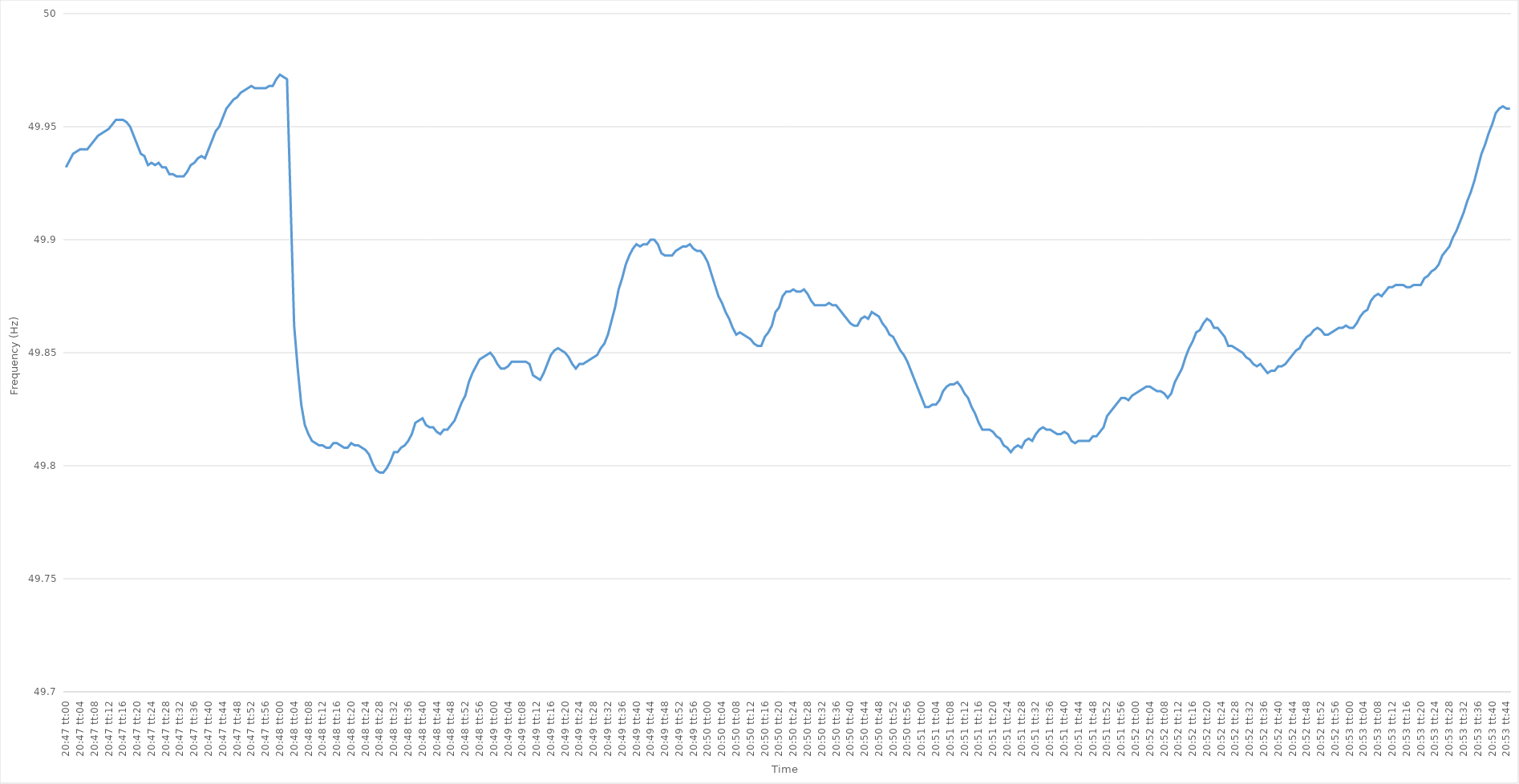
| Category | Series 0 |
|---|---|
| 0.8659722222222223 | 49.932 |
| 0.8659837962962963 | 49.935 |
| 0.8659953703703703 | 49.938 |
| 0.8660069444444445 | 49.939 |
| 0.8660185185185186 | 49.94 |
| 0.8660300925925926 | 49.94 |
| 0.8660416666666667 | 49.94 |
| 0.8660532407407407 | 49.942 |
| 0.8660648148148148 | 49.944 |
| 0.8660763888888888 | 49.946 |
| 0.866087962962963 | 49.947 |
| 0.8660995370370371 | 49.948 |
| 0.866111111111111 | 49.949 |
| 0.8661226851851852 | 49.951 |
| 0.8661342592592592 | 49.953 |
| 0.8661458333333334 | 49.953 |
| 0.8661574074074073 | 49.953 |
| 0.8661689814814815 | 49.952 |
| 0.8661805555555556 | 49.95 |
| 0.8661921296296297 | 49.946 |
| 0.8662037037037037 | 49.942 |
| 0.8662152777777777 | 49.938 |
| 0.8662268518518519 | 49.937 |
| 0.866238425925926 | 49.933 |
| 0.86625 | 49.934 |
| 0.8662615740740741 | 49.933 |
| 0.8662731481481482 | 49.934 |
| 0.8662847222222222 | 49.932 |
| 0.8662962962962962 | 49.932 |
| 0.8663078703703704 | 49.929 |
| 0.8663194444444445 | 49.929 |
| 0.8663310185185185 | 49.928 |
| 0.8663425925925926 | 49.928 |
| 0.8663541666666666 | 49.928 |
| 0.8663657407407408 | 49.93 |
| 0.8663773148148147 | 49.933 |
| 0.8663888888888889 | 49.934 |
| 0.866400462962963 | 49.936 |
| 0.8664120370370371 | 49.937 |
| 0.8664236111111111 | 49.936 |
| 0.8664351851851851 | 49.94 |
| 0.8664467592592593 | 49.944 |
| 0.8664583333333334 | 49.948 |
| 0.8664699074074074 | 49.95 |
| 0.8664814814814815 | 49.954 |
| 0.8664930555555556 | 49.958 |
| 0.8665046296296296 | 49.96 |
| 0.8665162037037036 | 49.962 |
| 0.8665277777777778 | 49.963 |
| 0.8665393518518519 | 49.965 |
| 0.8665509259259259 | 49.966 |
| 0.8665625 | 49.967 |
| 0.866574074074074 | 49.968 |
| 0.8665856481481482 | 49.967 |
| 0.8665972222222221 | 49.967 |
| 0.8666087962962963 | 49.967 |
| 0.8666203703703704 | 49.967 |
| 0.8666319444444445 | 49.968 |
| 0.8666435185185185 | 49.968 |
| 0.8666550925925925 | 49.971 |
| 0.8666666666666667 | 49.973 |
| 0.8666782407407408 | 49.972 |
| 0.8666898148148148 | 49.971 |
| 0.8667013888888889 | 49.917 |
| 0.866712962962963 | 49.862 |
| 0.866724537037037 | 49.843 |
| 0.866736111111111 | 49.827 |
| 0.8667476851851852 | 49.818 |
| 0.8667592592592593 | 49.814 |
| 0.8667708333333333 | 49.811 |
| 0.8667824074074074 | 49.81 |
| 0.8667939814814815 | 49.809 |
| 0.8668055555555556 | 49.809 |
| 0.8668171296296295 | 49.808 |
| 0.8668287037037037 | 49.808 |
| 0.8668402777777778 | 49.81 |
| 0.8668518518518519 | 49.81 |
| 0.8668634259259259 | 49.809 |
| 0.866875 | 49.808 |
| 0.8668865740740741 | 49.808 |
| 0.8668981481481483 | 49.81 |
| 0.8669097222222222 | 49.809 |
| 0.8669212962962963 | 49.809 |
| 0.8669328703703704 | 49.808 |
| 0.8669444444444444 | 49.807 |
| 0.8669560185185184 | 49.805 |
| 0.8669675925925926 | 49.801 |
| 0.8669791666666667 | 49.798 |
| 0.8669907407407407 | 49.797 |
| 0.8670023148148148 | 49.797 |
| 0.8670138888888889 | 49.799 |
| 0.867025462962963 | 49.802 |
| 0.8670370370370369 | 49.806 |
| 0.8670486111111111 | 49.806 |
| 0.8670601851851852 | 49.808 |
| 0.8670717592592593 | 49.809 |
| 0.8670833333333333 | 49.811 |
| 0.8670949074074074 | 49.814 |
| 0.8671064814814815 | 49.819 |
| 0.8671180555555557 | 49.82 |
| 0.8671296296296296 | 49.821 |
| 0.8671412037037037 | 49.818 |
| 0.8671527777777778 | 49.817 |
| 0.8671643518518519 | 49.817 |
| 0.8671759259259259 | 49.815 |
| 0.8671875 | 49.814 |
| 0.8671990740740741 | 49.816 |
| 0.8672106481481481 | 49.816 |
| 0.8672222222222222 | 49.818 |
| 0.8672337962962963 | 49.82 |
| 0.8672453703703704 | 49.824 |
| 0.8672569444444443 | 49.828 |
| 0.8672685185185185 | 49.831 |
| 0.8672800925925926 | 49.837 |
| 0.8672916666666667 | 49.841 |
| 0.8673032407407407 | 49.844 |
| 0.8673148148148148 | 49.847 |
| 0.8673263888888889 | 49.848 |
| 0.8673379629629631 | 49.849 |
| 0.867349537037037 | 49.85 |
| 0.8673611111111111 | 49.848 |
| 0.8673726851851852 | 49.845 |
| 0.8673842592592593 | 49.843 |
| 0.8673958333333333 | 49.843 |
| 0.8674074074074074 | 49.844 |
| 0.8674189814814816 | 49.846 |
| 0.8674305555555556 | 49.846 |
| 0.8674421296296296 | 49.846 |
| 0.8674537037037037 | 49.846 |
| 0.8674652777777778 | 49.846 |
| 0.8674768518518517 | 49.845 |
| 0.8674884259259259 | 49.84 |
| 0.8675 | 49.839 |
| 0.8675115740740741 | 49.838 |
| 0.8675231481481481 | 49.841 |
| 0.8675347222222222 | 49.845 |
| 0.8675462962962963 | 49.849 |
| 0.8675578703703705 | 49.851 |
| 0.8675694444444444 | 49.852 |
| 0.8675810185185185 | 49.851 |
| 0.8675925925925926 | 49.85 |
| 0.8676041666666667 | 49.848 |
| 0.8676157407407407 | 49.845 |
| 0.8676273148148148 | 49.843 |
| 0.867638888888889 | 49.845 |
| 0.867650462962963 | 49.845 |
| 0.867662037037037 | 49.846 |
| 0.8676736111111111 | 49.847 |
| 0.8676851851851852 | 49.848 |
| 0.8676967592592592 | 49.849 |
| 0.8677083333333333 | 49.852 |
| 0.8677199074074075 | 49.854 |
| 0.8677314814814815 | 49.858 |
| 0.8677430555555555 | 49.864 |
| 0.8677546296296296 | 49.87 |
| 0.8677662037037037 | 49.878 |
| 0.8677777777777779 | 49.883 |
| 0.8677893518518518 | 49.889 |
| 0.867800925925926 | 49.893 |
| 0.8678125 | 49.896 |
| 0.8678240740740741 | 49.898 |
| 0.8678356481481481 | 49.897 |
| 0.8678472222222222 | 49.898 |
| 0.8678587962962964 | 49.898 |
| 0.8678703703703704 | 49.9 |
| 0.8678819444444444 | 49.9 |
| 0.8678935185185185 | 49.898 |
| 0.8679050925925926 | 49.894 |
| 0.8679166666666666 | 49.893 |
| 0.8679282407407407 | 49.893 |
| 0.8679398148148149 | 49.893 |
| 0.8679513888888889 | 49.895 |
| 0.8679629629629629 | 49.896 |
| 0.867974537037037 | 49.897 |
| 0.8679861111111111 | 49.897 |
| 0.8679976851851853 | 49.898 |
| 0.8680092592592592 | 49.896 |
| 0.8680208333333334 | 49.895 |
| 0.8680324074074074 | 49.895 |
| 0.8680439814814815 | 49.893 |
| 0.8680555555555555 | 49.89 |
| 0.8680671296296296 | 49.885 |
| 0.8680787037037038 | 49.88 |
| 0.8680902777777778 | 49.875 |
| 0.8681018518518518 | 49.872 |
| 0.8681134259259259 | 49.868 |
| 0.868125 | 49.865 |
| 0.868136574074074 | 49.861 |
| 0.8681481481481481 | 49.858 |
| 0.8681597222222223 | 49.859 |
| 0.8681712962962963 | 49.858 |
| 0.8681828703703703 | 49.857 |
| 0.8681944444444444 | 49.856 |
| 0.8682060185185185 | 49.854 |
| 0.8682175925925927 | 49.853 |
| 0.8682291666666666 | 49.853 |
| 0.8682407407407408 | 49.857 |
| 0.8682523148148148 | 49.859 |
| 0.868263888888889 | 49.862 |
| 0.8682754629629629 | 49.868 |
| 0.868287037037037 | 49.87 |
| 0.8682986111111112 | 49.875 |
| 0.8683101851851852 | 49.877 |
| 0.8683217592592593 | 49.877 |
| 0.8683333333333333 | 49.878 |
| 0.8683449074074074 | 49.877 |
| 0.8683564814814814 | 49.877 |
| 0.8683680555555555 | 49.878 |
| 0.8683796296296297 | 49.876 |
| 0.8683912037037037 | 49.873 |
| 0.8684027777777777 | 49.871 |
| 0.8684143518518518 | 49.871 |
| 0.8684259259259259 | 49.871 |
| 0.8684375000000001 | 49.871 |
| 0.868449074074074 | 49.872 |
| 0.8684606481481482 | 49.871 |
| 0.8684722222222222 | 49.871 |
| 0.8684837962962964 | 49.869 |
| 0.8684953703703703 | 49.867 |
| 0.8685069444444444 | 49.865 |
| 0.8685185185185186 | 49.863 |
| 0.8685300925925926 | 49.862 |
| 0.8685416666666667 | 49.862 |
| 0.8685532407407407 | 49.865 |
| 0.8685648148148148 | 49.866 |
| 0.868576388888889 | 49.865 |
| 0.8685879629629629 | 49.868 |
| 0.8685995370370371 | 49.867 |
| 0.8686111111111111 | 49.866 |
| 0.8686226851851853 | 49.863 |
| 0.8686342592592592 | 49.861 |
| 0.8686458333333333 | 49.858 |
| 0.8686574074074075 | 49.857 |
| 0.8686689814814814 | 49.854 |
| 0.8686805555555556 | 49.851 |
| 0.8686921296296296 | 49.849 |
| 0.8687037037037038 | 49.846 |
| 0.8687152777777777 | 49.842 |
| 0.8687268518518518 | 49.838 |
| 0.868738425925926 | 49.834 |
| 0.86875 | 49.83 |
| 0.8687615740740741 | 49.826 |
| 0.8687731481481481 | 49.826 |
| 0.8687847222222222 | 49.827 |
| 0.8687962962962964 | 49.827 |
| 0.8688078703703703 | 49.829 |
| 0.8688194444444445 | 49.833 |
| 0.8688310185185185 | 49.835 |
| 0.8688425925925927 | 49.836 |
| 0.8688541666666666 | 49.836 |
| 0.8688657407407407 | 49.837 |
| 0.8688773148148149 | 49.835 |
| 0.8688888888888888 | 49.832 |
| 0.868900462962963 | 49.83 |
| 0.868912037037037 | 49.826 |
| 0.8689236111111112 | 49.823 |
| 0.8689351851851851 | 49.819 |
| 0.8689467592592592 | 49.816 |
| 0.8689583333333334 | 49.816 |
| 0.8689699074074074 | 49.816 |
| 0.8689814814814815 | 49.815 |
| 0.8689930555555555 | 49.813 |
| 0.8690046296296297 | 49.812 |
| 0.8690162037037038 | 49.809 |
| 0.8690277777777777 | 49.808 |
| 0.8690393518518519 | 49.806 |
| 0.8690509259259259 | 49.808 |
| 0.8690625000000001 | 49.809 |
| 0.869074074074074 | 49.808 |
| 0.8690856481481481 | 49.811 |
| 0.8690972222222223 | 49.812 |
| 0.8691087962962962 | 49.811 |
| 0.8691203703703704 | 49.814 |
| 0.8691319444444444 | 49.816 |
| 0.8691435185185186 | 49.817 |
| 0.8691550925925925 | 49.816 |
| 0.8691666666666666 | 49.816 |
| 0.8691782407407408 | 49.815 |
| 0.8691898148148148 | 49.814 |
| 0.8692013888888889 | 49.814 |
| 0.8692129629629629 | 49.815 |
| 0.8692245370370371 | 49.814 |
| 0.8692361111111112 | 49.811 |
| 0.8692476851851851 | 49.81 |
| 0.8692592592592593 | 49.811 |
| 0.8692708333333333 | 49.811 |
| 0.8692824074074075 | 49.811 |
| 0.8692939814814814 | 49.811 |
| 0.8693055555555556 | 49.813 |
| 0.8693171296296297 | 49.813 |
| 0.8693287037037036 | 49.815 |
| 0.8693402777777778 | 49.817 |
| 0.8693518518518518 | 49.822 |
| 0.869363425925926 | 49.824 |
| 0.8693749999999999 | 49.826 |
| 0.869386574074074 | 49.828 |
| 0.8693981481481482 | 49.83 |
| 0.8694097222222222 | 49.83 |
| 0.8694212962962963 | 49.829 |
| 0.8694328703703703 | 49.831 |
| 0.8694444444444445 | 49.832 |
| 0.8694560185185186 | 49.833 |
| 0.8694675925925925 | 49.834 |
| 0.8694791666666667 | 49.835 |
| 0.8694907407407407 | 49.835 |
| 0.8695023148148149 | 49.834 |
| 0.8695138888888888 | 49.833 |
| 0.869525462962963 | 49.833 |
| 0.8695370370370371 | 49.832 |
| 0.869548611111111 | 49.83 |
| 0.8695601851851852 | 49.832 |
| 0.8695717592592592 | 49.837 |
| 0.8695833333333334 | 49.84 |
| 0.8695949074074073 | 49.843 |
| 0.8696064814814815 | 49.848 |
| 0.8696180555555556 | 49.852 |
| 0.8696296296296296 | 49.855 |
| 0.8696412037037037 | 49.859 |
| 0.8696527777777777 | 49.86 |
| 0.8696643518518519 | 49.863 |
| 0.869675925925926 | 49.865 |
| 0.8696875 | 49.864 |
| 0.8696990740740741 | 49.861 |
| 0.8697106481481481 | 49.861 |
| 0.8697222222222223 | 49.859 |
| 0.8697337962962962 | 49.857 |
| 0.8697453703703704 | 49.853 |
| 0.8697569444444445 | 49.853 |
| 0.8697685185185186 | 49.852 |
| 0.8697800925925926 | 49.851 |
| 0.8697916666666666 | 49.85 |
| 0.8698032407407408 | 49.848 |
| 0.8698148148148147 | 49.847 |
| 0.8698263888888889 | 49.845 |
| 0.869837962962963 | 49.844 |
| 0.869849537037037 | 49.845 |
| 0.8698611111111111 | 49.843 |
| 0.8698726851851851 | 49.841 |
| 0.8698842592592593 | 49.842 |
| 0.8698958333333334 | 49.842 |
| 0.8699074074074074 | 49.844 |
| 0.8699189814814815 | 49.844 |
| 0.8699305555555555 | 49.845 |
| 0.8699421296296297 | 49.847 |
| 0.8699537037037036 | 49.849 |
| 0.8699652777777778 | 49.851 |
| 0.8699768518518519 | 49.852 |
| 0.869988425925926 | 49.855 |
| 0.87 | 49.857 |
| 0.870011574074074 | 49.858 |
| 0.8700231481481482 | 49.86 |
| 0.8700347222222223 | 49.861 |
| 0.8700462962962963 | 49.86 |
| 0.8700578703703704 | 49.858 |
| 0.8700694444444445 | 49.858 |
| 0.8700810185185185 | 49.859 |
| 0.8700925925925925 | 49.86 |
| 0.8701041666666667 | 49.861 |
| 0.8701157407407408 | 49.861 |
| 0.8701273148148148 | 49.862 |
| 0.8701388888888889 | 49.861 |
| 0.870150462962963 | 49.861 |
| 0.8701620370370371 | 49.863 |
| 0.870173611111111 | 49.866 |
| 0.8701851851851852 | 49.868 |
| 0.8701967592592593 | 49.869 |
| 0.8702083333333334 | 49.873 |
| 0.8702199074074074 | 49.875 |
| 0.8702314814814814 | 49.876 |
| 0.8702430555555556 | 49.875 |
| 0.8702546296296297 | 49.877 |
| 0.8702662037037037 | 49.879 |
| 0.8702777777777778 | 49.879 |
| 0.8702893518518519 | 49.88 |
| 0.8703009259259259 | 49.88 |
| 0.8703124999999999 | 49.88 |
| 0.8703240740740741 | 49.879 |
| 0.8703356481481482 | 49.879 |
| 0.8703472222222222 | 49.88 |
| 0.8703587962962963 | 49.88 |
| 0.8703703703703703 | 49.88 |
| 0.8703819444444445 | 49.883 |
| 0.8703935185185184 | 49.884 |
| 0.8704050925925926 | 49.886 |
| 0.8704166666666667 | 49.887 |
| 0.8704282407407408 | 49.889 |
| 0.8704398148148148 | 49.893 |
| 0.8704513888888888 | 49.895 |
| 0.870462962962963 | 49.897 |
| 0.8704745370370371 | 49.901 |
| 0.8704861111111111 | 49.904 |
| 0.8704976851851852 | 49.908 |
| 0.8705092592592593 | 49.912 |
| 0.8705208333333333 | 49.917 |
| 0.8705324074074073 | 49.921 |
| 0.8705439814814815 | 49.926 |
| 0.8705555555555556 | 49.932 |
| 0.8705671296296296 | 49.938 |
| 0.8705787037037037 | 49.942 |
| 0.8705902777777778 | 49.947 |
| 0.8706018518518519 | 49.951 |
| 0.8706134259259258 | 49.956 |
| 0.870625 | 49.958 |
| 0.8706365740740741 | 49.959 |
| 0.8706481481481482 | 49.958 |
| 0.8706597222222222 | 49.958 |